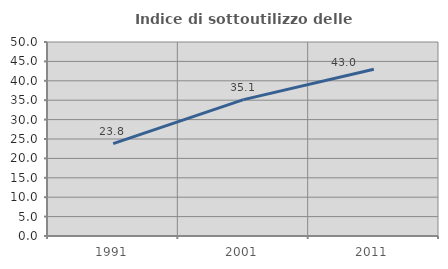
| Category | Indice di sottoutilizzo delle abitazioni  |
|---|---|
| 1991.0 | 23.828 |
| 2001.0 | 35.145 |
| 2011.0 | 42.994 |